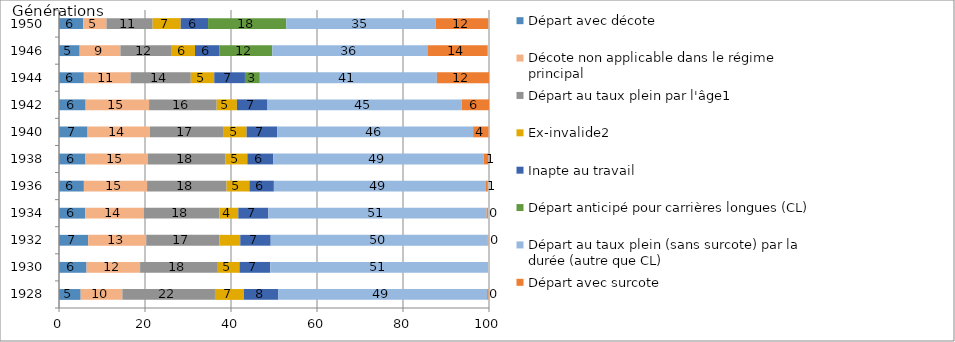
| Category | Départ avec décote | Décote non applicable dans le régime principal  | Départ au taux plein par l'âge1 | Ex-invalide2 | Inapte au travail | Départ anticipé pour carrières longues (CL) | Départ au taux plein (sans surcote) par la durée (autre que CL) | Départ avec surcote |
|---|---|---|---|---|---|---|---|---|
| 1928.0 | 5.043 | 9.691 | 21.537 | 6.745 | 7.939 | 0 | 48.607 | 0.303 |
| 1930.0 | 6.415 | 12.451 | 18.078 | 5.028 | 7.139 | 0 | 50.657 | 0 |
| 1932.0 | 6.791 | 13.488 | 16.997 | 4.874 | 7.086 | 0 | 50.5 | 0.093 |
| 1934.0 | 6.08 | 13.623 | 17.563 | 4.436 | 6.989 | 0 | 50.742 | 0.314 |
| 1936.0 | 5.787 | 14.692 | 18.488 | 5.314 | 5.692 | 0 | 49.192 | 0.571 |
| 1938.0 | 6.163 | 14.541 | 18.043 | 5.05 | 6.001 | 0 | 49.004 | 1.029 |
| 1940.0 | 6.645 | 14.494 | 17.18 | 5.304 | 7.114 | 0 | 45.571 | 3.572 |
| 1942.0 | 6.193 | 14.75 | 15.726 | 4.702 | 7.121 | 0 | 45.159 | 6.349 |
| 1944.0 | 5.774 | 10.864 | 14.012 | 5.454 | 7.142 | 3.456 | 41.177 | 12.115 |
| 1946.0 | 4.81 | 9.473 | 11.769 | 5.578 | 5.729 | 12.251 | 36.207 | 13.891 |
| 1950.0 | 5.654 | 5.388 | 10.738 | 6.518 | 6.366 | 18.183 | 34.772 | 12.212 |